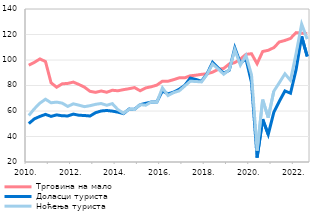
| Category | Трговина на мало | Доласци туриста | Ноћења туриста  |
|---|---|---|---|
| 2010. | 95.895 | 50.141 | 56.467 |
| II | 98.147 | 53.821 | 61.73 |
| III | 100.837 | 55.77 | 66.167 |
| IV | 98.786 | 57.332 | 69.238 |
| 2011. | 82.145 | 55.782 | 66.448 |
| II | 78.661 | 56.954 | 66.961 |
| III | 81.305 | 56.228 | 66.177 |
| IV | 81.637 | 56.137 | 63.576 |
| 2012. | 82.663 | 57.544 | 65.644 |
| II | 80.817 | 56.673 | 64.579 |
| III | 78.671 | 56.472 | 63.406 |
| IV | 75.427 | 56.08 | 64.172 |
| 2013. | 74.626 | 58.687 | 65.239 |
| II | 75.686 | 60.01 | 65.865 |
| III | 74.704 | 60.4 | 64.492 |
| IV | 76.268 | 59.905 | 65.774 |
| 2014. | 75.864 | 59.106 | 61.099 |
| II | 76.74 | 57.945 | 58.316 |
| III | 77.489 | 61.487 | 61.299 |
| IV | 78.349 | 61.369 | 61.264 |
| 2015. | 75.87 | 64.948 | 65.004 |
| II | 78.114 | 66.012 | 64.55 |
| III | 79.02 | 67.016 | 67.103 |
| IV | 80.315 | 67.14 | 66.858 |
| 2016. | 83.391 | 75.721 | 78.128 |
| II | 83.336 | 73.435 | 72.137 |
| III | 84.578 | 74.794 | 74.423 |
| IV | 85.983 | 77.028 | 75.763 |
| 2017. | 86.01 | 80.067 | 79.607 |
| II | 87.628 | 85.835 | 83.345 |
| III | 88.067 | 84.745 | 83.149 |
| IV | 88.732 | 83.377 | 82.8 |
| 2018. | 89.196 | 88.985 | 88.645 |
| II | 90.439 | 98.147 | 96.869 |
| III | 92.692 | 93.844 | 92.992 |
| IV | 93.38 | 89.608 | 88.834 |
| 2019. | 96.868 | 91.949 | 92.35 |
| II | 97.958 | 109.565 | 108.077 |
| III | 100.754 | 97.487 | 96.032 |
| IV | 104.421 | 100.999 | 103.541 |
| 2020. | 104.921 | 82.257 | 88.297 |
| II | 97.107 | 23.453 | 28.985 |
| III | 106.667 | 53.571 | 68.878 |
| IV | 107.611 | 41.643 | 54.778 |
| 2021. | 109.697 | 58.917 | 75.505 |
| II | 114.152 | 67.647 | 82.227 |
| III | 115.337 | 75.732 | 89.22 |
| IV | 116.914 | 73.904 | 84.003 |
| 2022. | 121.475 | 92.434 | 105.151 |
| II | 121.026 | 118.576 | 128.146 |
| III | 120.774 | 102.792 | 116.383 |